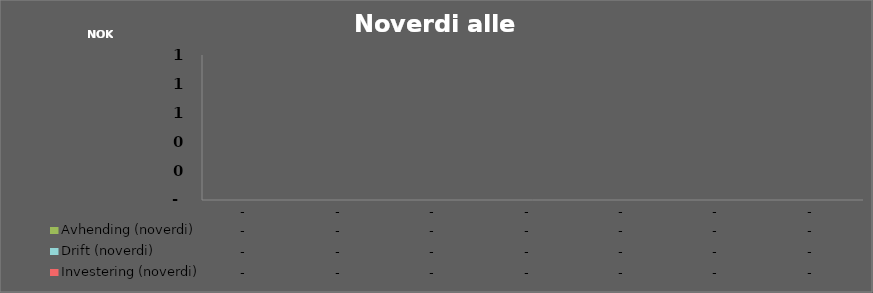
| Category | Investering (noverdi) | Drift (noverdi) | Avhending (noverdi) |
|---|---|---|---|
| 0.0 | 0 | 0 | 0 |
| 0.0 | 0 | 0 | 0 |
| 0.0 | 0 | 0 | 0 |
| 0.0 | 0 | 0 | 0 |
| 0.0 | 0 | 0 | 0 |
| 0.0 | 0 | 0 | 0 |
| 0.0 | 0 | 0 | 0 |